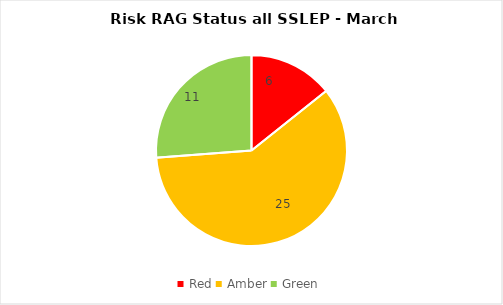
| Category | SSLEP |
|---|---|
| Red | 6 |
| Amber | 25 |
| Green | 11 |